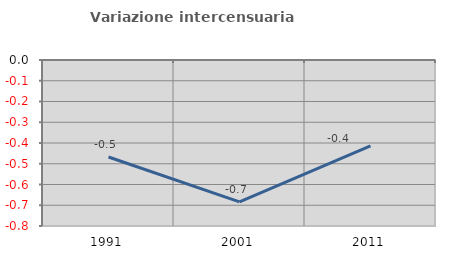
| Category | Variazione intercensuaria annua |
|---|---|
| 1991.0 | -0.468 |
| 2001.0 | -0.684 |
| 2011.0 | -0.413 |